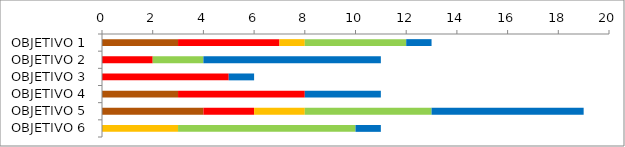
| Category | Series 0 | Series 1 | Series 2 | Series 3 | Series 4 | Series 5 |
|---|---|---|---|---|---|---|
| OBJETIVO 1 | 3 | 0 | 4 | 1 | 4 | 1 |
| OBJETIVO 2 | 0 | 0 | 2 | 0 | 2 | 7 |
| OBJETIVO 3 | 0 | 0 | 5 | 0 | 0 | 1 |
| OBJETIVO 4 | 3 | 0 | 5 | 0 | 0 | 3 |
| OBJETIVO 5 | 4 | 0 | 2 | 2 | 5 | 6 |
| OBJETIVO 6 | 0 | 0 | 0 | 3 | 7 | 1 |